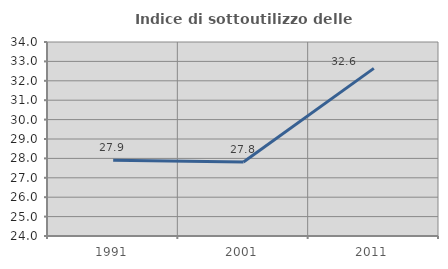
| Category | Indice di sottoutilizzo delle abitazioni  |
|---|---|
| 1991.0 | 27.907 |
| 2001.0 | 27.815 |
| 2011.0 | 32.641 |